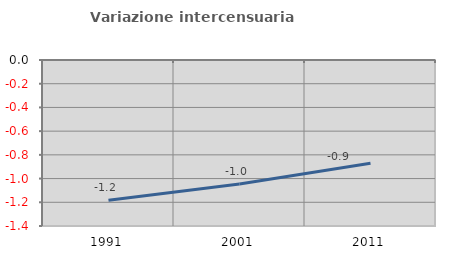
| Category | Variazione intercensuaria annua |
|---|---|
| 1991.0 | -1.183 |
| 2001.0 | -1.046 |
| 2011.0 | -0.871 |